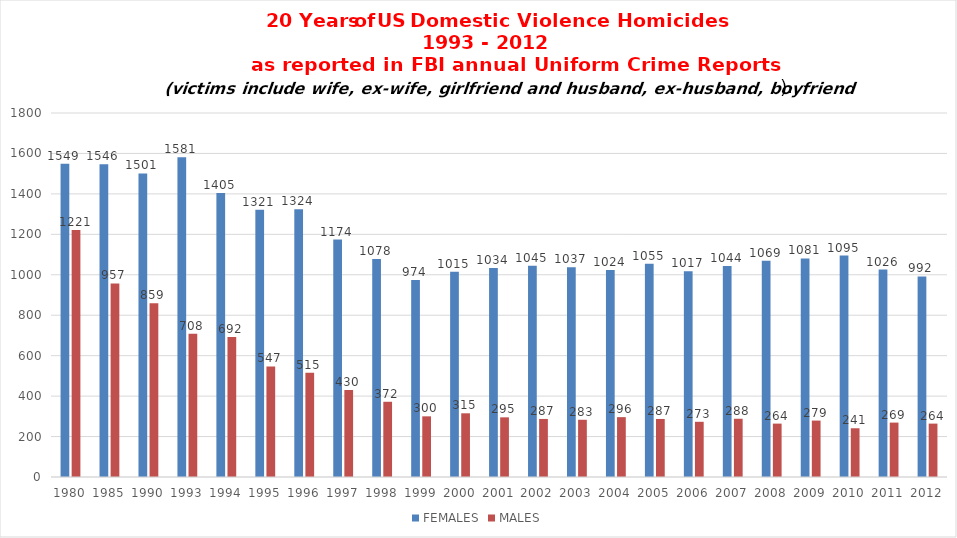
| Category | FEMALES | MALES |
|---|---|---|
| 1980.0 | 1549 | 1221 |
| 1985.0 | 1546 | 957 |
| 1990.0 | 1501 | 859 |
| 1993.0 | 1581 | 708 |
| 1994.0 | 1405 | 692 |
| 1995.0 | 1321 | 547 |
| 1996.0 | 1324 | 515 |
| 1997.0 | 1174 | 430 |
| 1998.0 | 1078 | 372 |
| 1999.0 | 974 | 300 |
| 2000.0 | 1015 | 315 |
| 2001.0 | 1034 | 295 |
| 2002.0 | 1045 | 287 |
| 2003.0 | 1037 | 283 |
| 2004.0 | 1024 | 296 |
| 2005.0 | 1055 | 287 |
| 2006.0 | 1017 | 273 |
| 2007.0 | 1044 | 288 |
| 2008.0 | 1069 | 264 |
| 2009.0 | 1081 | 279 |
| 2010.0 | 1095 | 241 |
| 2011.0 | 1026 | 269 |
| 2012.0 | 992 | 264 |